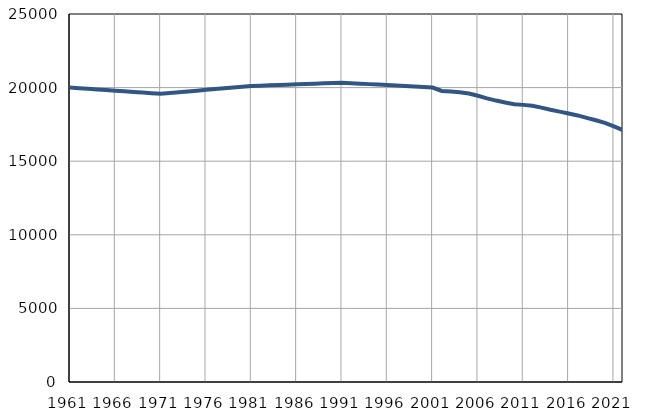
| Category | Број
становника |
|---|---|
| 1961.0 | 20001 |
| 1962.0 | 19959 |
| 1963.0 | 19917 |
| 1964.0 | 19875 |
| 1965.0 | 19833 |
| 1966.0 | 19791 |
| 1967.0 | 19749 |
| 1968.0 | 19707 |
| 1969.0 | 19665 |
| 1970.0 | 19623 |
| 1971.0 | 19581 |
| 1972.0 | 19634 |
| 1973.0 | 19687 |
| 1974.0 | 19740 |
| 1975.0 | 19793 |
| 1976.0 | 19846 |
| 1977.0 | 19899 |
| 1978.0 | 19952 |
| 1979.0 | 20005 |
| 1980.0 | 20058 |
| 1981.0 | 20111 |
| 1982.0 | 20133 |
| 1983.0 | 20156 |
| 1984.0 | 20178 |
| 1985.0 | 20201 |
| 1986.0 | 20223 |
| 1987.0 | 20245 |
| 1988.0 | 20268 |
| 1989.0 | 20290 |
| 1990.0 | 20313 |
| 1991.0 | 20335 |
| 1992.0 | 20302 |
| 1993.0 | 20269 |
| 1994.0 | 20236 |
| 1995.0 | 20203 |
| 1996.0 | 20170 |
| 1997.0 | 20137 |
| 1998.0 | 20104 |
| 1999.0 | 20071 |
| 2000.0 | 20038 |
| 2001.0 | 20005 |
| 2002.0 | 19772 |
| 2003.0 | 19727 |
| 2004.0 | 19690 |
| 2005.0 | 19602 |
| 2006.0 | 19443 |
| 2007.0 | 19272 |
| 2008.0 | 19119 |
| 2009.0 | 18987 |
| 2010.0 | 18875 |
| 2011.0 | 18826 |
| 2012.0 | 18765 |
| 2013.0 | 18642 |
| 2014.0 | 18495 |
| 2015.0 | 18369 |
| 2016.0 | 18240 |
| 2017.0 | 18109 |
| 2018.0 | 17947 |
| 2019.0 | 17779 |
| 2020.0 | 17609 |
| 2021.0 | 17368 |
| 2022.0 | 17111 |